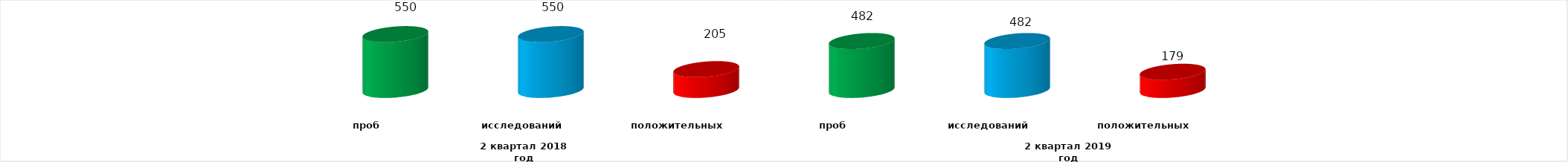
| Category | Series 4 |
|---|---|
| 0 | 550 |
| 1 | 550 |
| 2 | 205 |
| 3 | 482 |
| 4 | 482 |
| 5 | 179 |